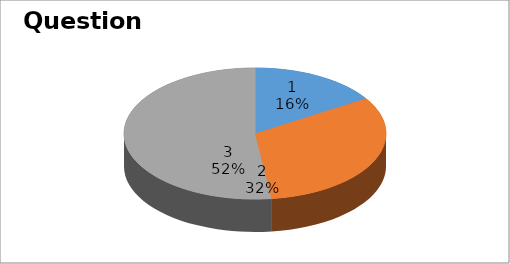
| Category | Series 0 |
|---|---|
| 0 | 4 |
| 1 | 8 |
| 2 | 13 |